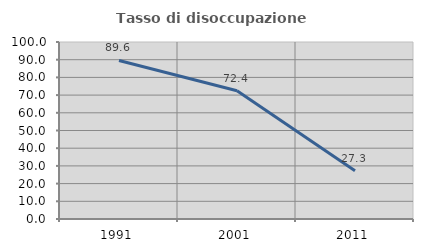
| Category | Tasso di disoccupazione giovanile  |
|---|---|
| 1991.0 | 89.552 |
| 2001.0 | 72.414 |
| 2011.0 | 27.273 |